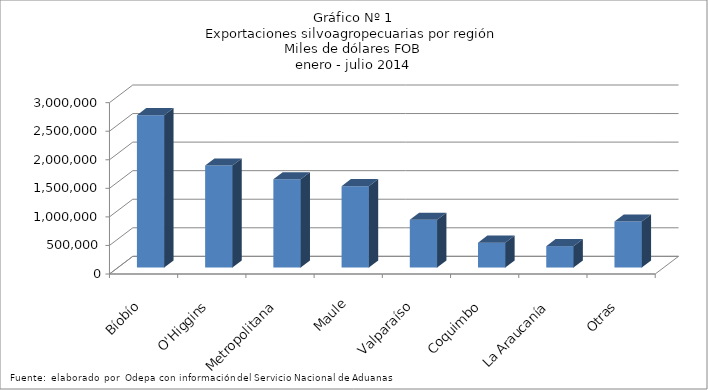
| Category | Series 0 |
|---|---|
| Bíobío | 2667652.707 |
| O'Higgins | 1786584.915 |
| Metropolitana | 1545472.8 |
| Maule | 1424256.63 |
| Valparaíso | 835073.995 |
| Coquimbo | 435726.464 |
| La Araucanía | 374421.503 |
| Otras | 804267.71 |